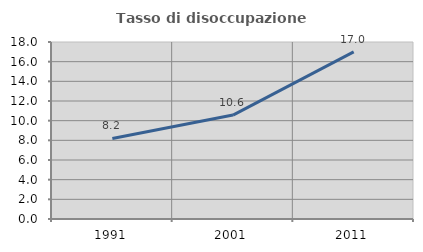
| Category | Tasso di disoccupazione giovanile  |
|---|---|
| 1991.0 | 8.188 |
| 2001.0 | 10.569 |
| 2011.0 | 16.988 |